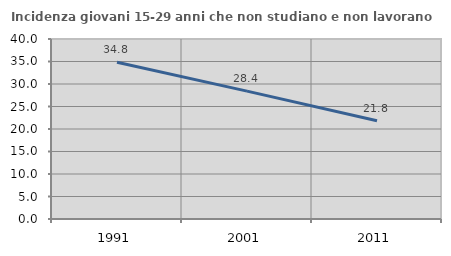
| Category | Incidenza giovani 15-29 anni che non studiano e non lavorano  |
|---|---|
| 1991.0 | 34.842 |
| 2001.0 | 28.417 |
| 2011.0 | 21.842 |